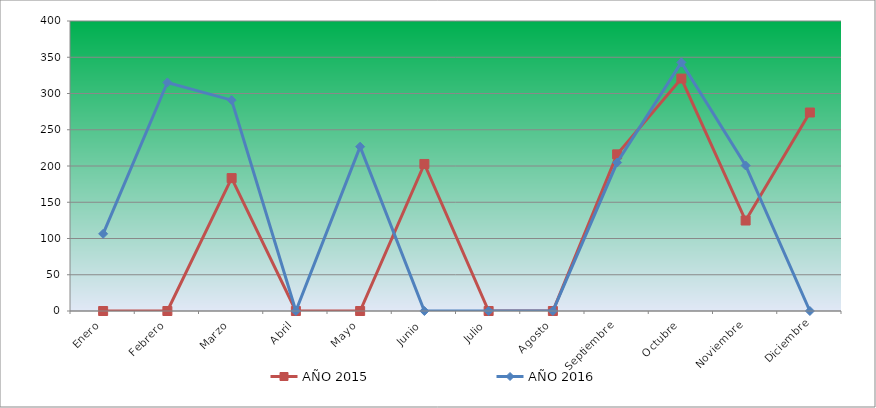
| Category | AÑO 2015 | AÑO 2016 |
|---|---|---|
| Enero | 0 | 106.439 |
| Febrero | 0 | 315.254 |
| Marzo | 183.305 | 290.878 |
| Abril | 0 | 0 |
| Mayo | 0 | 226.69 |
| Junio | 202.806 | 0 |
| Julio | 0 | 0 |
| Agosto | 0 | 0 |
| Septiembre | 216.066 | 204.752 |
| Octubre | 320.589 | 342.879 |
| Noviembre | 124.803 | 200.69 |
| Diciembre | 273.788 | 0 |